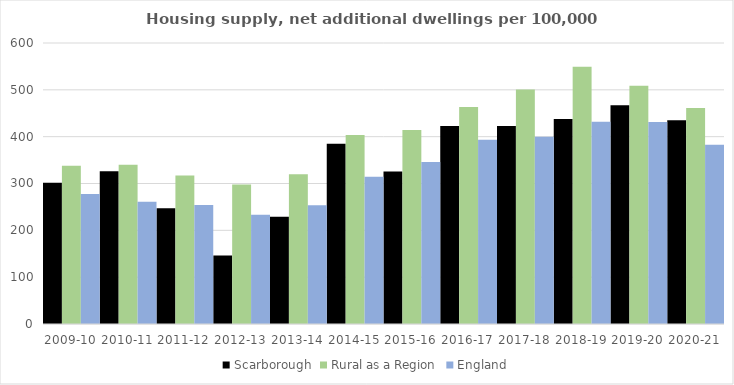
| Category | Scarborough | Rural as a Region | England |
|---|---|---|---|
| 2009-10 | 301.35 | 337.852 | 277.548 |
| 2010-11 | 325.921 | 340.105 | 260.994 |
| 2011-12 | 247.39 | 317.04 | 254.007 |
| 2012-13 | 146.325 | 297.763 | 233.153 |
| 2013-14 | 228.93 | 319.835 | 253.602 |
| 2014-15 | 384.644 | 403.796 | 314.256 |
| 2015-16 | 325.658 | 414.091 | 346.154 |
| 2016-17 | 422.534 | 463.209 | 393.256 |
| 2017-18 | 422.626 | 500.68 | 399.646 |
| 2018-19 | 437.758 | 549.491 | 432.099 |
| 2019-20 | 467.096 | 508.493 | 431.187 |
| 2020-21 | 434.995 | 461.114 | 382.827 |